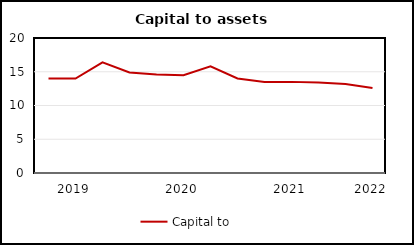
| Category | Capital to Assets |
|---|---|
| nan | 14 |
| 2019.0 | 14 |
| nan | 16.4 |
| nan | 14.9 |
| nan | 14.6 |
| 2020.0 | 14.5 |
| nan | 15.8 |
| nan | 14 |
| nan | 13.5 |
| 2021.0 | 13.5 |
| nan | 13.4 |
| nan | 13.2 |
| 2022.0 | 12.6 |